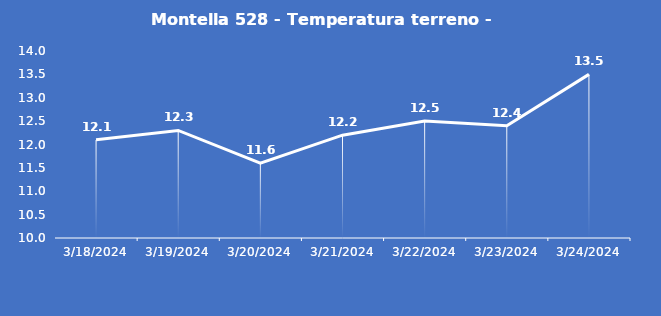
| Category | Montella 528 - Temperatura terreno - Grezzo (°C) |
|---|---|
| 3/18/24 | 12.1 |
| 3/19/24 | 12.3 |
| 3/20/24 | 11.6 |
| 3/21/24 | 12.2 |
| 3/22/24 | 12.5 |
| 3/23/24 | 12.4 |
| 3/24/24 | 13.5 |